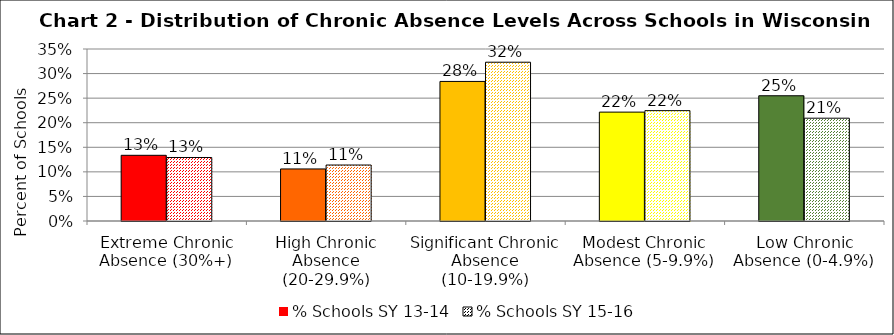
| Category | % Schools SY 13-14 | % Schools SY 15-16 |
|---|---|---|
| Extreme Chronic Absence (30%+) | 0.134 | 0.129 |
| High Chronic Absence (20-29.9%) | 0.106 | 0.114 |
| Significant Chronic Absence (10-19.9%) | 0.284 | 0.323 |
| Modest Chronic Absence (5-9.9%) | 0.222 | 0.225 |
| Low Chronic Absence (0-4.9%) | 0.255 | 0.209 |